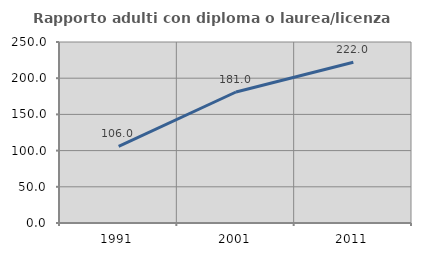
| Category | Rapporto adulti con diploma o laurea/licenza media  |
|---|---|
| 1991.0 | 105.98 |
| 2001.0 | 180.952 |
| 2011.0 | 221.951 |